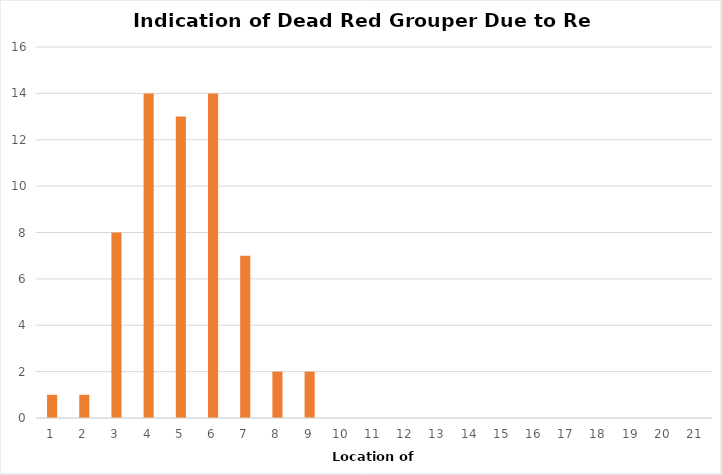
| Category | Series 1 |
|---|---|
| 1.0 | 1 |
| 2.0 | 1 |
| 3.0 | 8 |
| 4.0 | 14 |
| 5.0 | 13 |
| 6.0 | 14 |
| 7.0 | 7 |
| 8.0 | 2 |
| 9.0 | 2 |
| 10.0 | 0 |
| 11.0 | 0 |
| 12.0 | 0 |
| 13.0 | 0 |
| 14.0 | 0 |
| 15.0 | 0 |
| 16.0 | 0 |
| 17.0 | 0 |
| 18.0 | 0 |
| 19.0 | 0 |
| 20.0 | 0 |
| 21.0 | 0 |